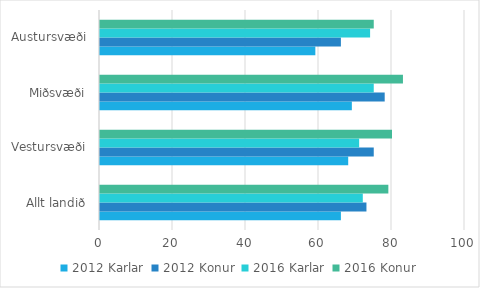
| Category | 2012 | 2016 |
|---|---|---|
| Allt landið | 73 | 79 |
| Vestursvæði | 75 | 80 |
| Miðsvæði | 78 | 83 |
| Austursvæði | 66 | 75 |